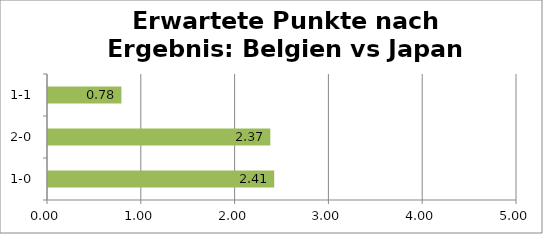
| Category | Series 0 |
|---|---|
| 1-0 | 2.412 |
| 2-0 | 2.37 |
| 1-1 | 0.783 |